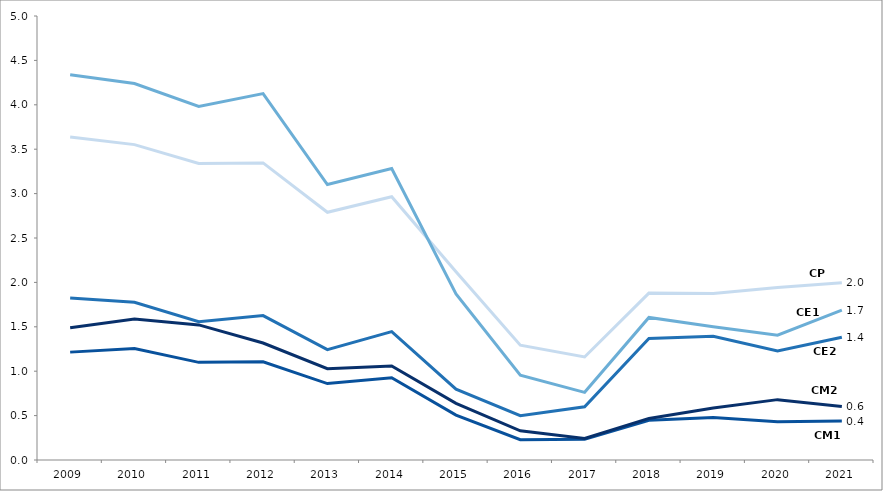
| Category | CP | CE1 | CE2 | CM1 | CM2 |
|---|---|---|---|---|---|
| 2009.0 | 3.637 | 4.338 | 1.824 | 1.215 | 1.489 |
| 2010.0 | 3.552 | 4.24 | 1.776 | 1.254 | 1.587 |
| 2011.0 | 3.34 | 3.982 | 1.557 | 1.1 | 1.521 |
| 2012.0 | 3.346 | 4.127 | 1.627 | 1.105 | 1.318 |
| 2013.0 | 2.789 | 3.102 | 1.243 | 0.861 | 1.029 |
| 2014.0 | 2.965 | 3.282 | 1.446 | 0.926 | 1.058 |
| 2015.0 | 2.121 | 1.87 | 0.797 | 0.505 | 0.638 |
| 2016.0 | 1.293 | 0.955 | 0.499 | 0.229 | 0.329 |
| 2017.0 | 1.16 | 0.762 | 0.6 | 0.234 | 0.242 |
| 2018.0 | 1.879 | 1.605 | 1.369 | 0.448 | 0.468 |
| 2019.0 | 1.875 | 1.501 | 1.393 | 0.478 | 0.587 |
| 2020.0 | 1.942 | 1.406 | 1.227 | 0.43 | 0.68 |
| 2021.0 | 1.995 | 1.689 | 1.382 | 0.439 | 0.603 |